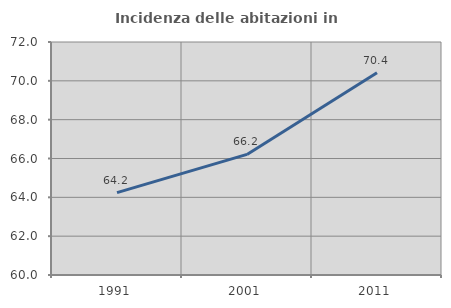
| Category | Incidenza delle abitazioni in proprietà  |
|---|---|
| 1991.0 | 64.24 |
| 2001.0 | 66.21 |
| 2011.0 | 70.416 |